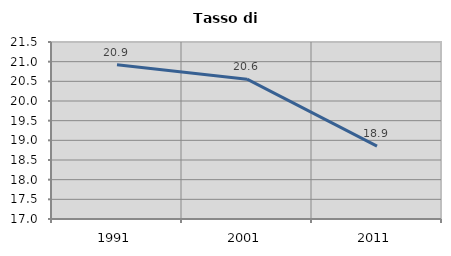
| Category | Tasso di disoccupazione   |
|---|---|
| 1991.0 | 20.92 |
| 2001.0 | 20.556 |
| 2011.0 | 18.852 |